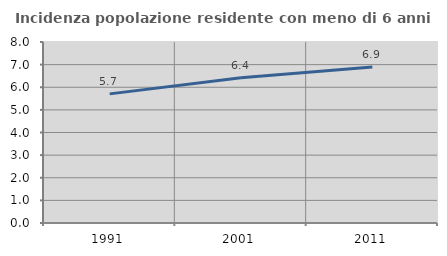
| Category | Incidenza popolazione residente con meno di 6 anni |
|---|---|
| 1991.0 | 5.707 |
| 2001.0 | 6.418 |
| 2011.0 | 6.897 |